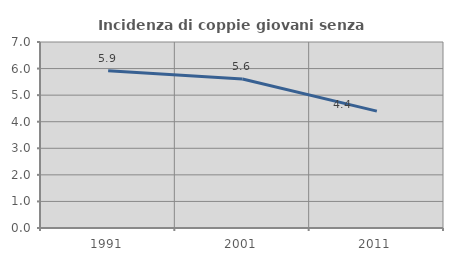
| Category | Incidenza di coppie giovani senza figli |
|---|---|
| 1991.0 | 5.916 |
| 2001.0 | 5.607 |
| 2011.0 | 4.399 |